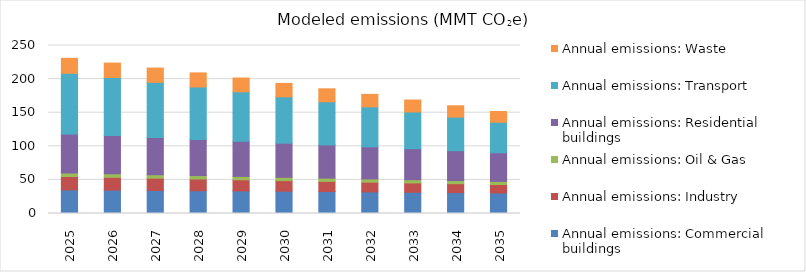
| Category | Annual emissions: Commercial buildings | Annual emissions: Industry | Annual emissions: Oil & Gas | Annual emissions: Residential buildings | Annual emissions: Transport | Annual emissions: Waste |
|---|---|---|---|---|---|---|
| 2025.0 | 35.146 | 19.883 | 5.265 | 58.171 | 90.126 | 22.368 |
| 2026.0 | 34.82 | 19.058 | 5.203 | 57.044 | 86.285 | 21.452 |
| 2027.0 | 34.327 | 18.23 | 5.14 | 55.218 | 82.245 | 21.249 |
| 2028.0 | 33.962 | 17.4 | 5.077 | 53.811 | 78.047 | 20.937 |
| 2029.0 | 33.598 | 16.566 | 5.013 | 52.356 | 73.587 | 20.511 |
| 2030.0 | 33.175 | 15.722 | 4.95 | 50.776 | 68.969 | 19.971 |
| 2031.0 | 32.667 | 15.113 | 4.886 | 49.363 | 64.199 | 19.33 |
| 2032.0 | 32.139 | 14.499 | 4.823 | 47.797 | 59.395 | 18.608 |
| 2033.0 | 31.624 | 13.879 | 4.759 | 46.205 | 54.63 | 17.788 |
| 2034.0 | 31.11 | 13.248 | 4.695 | 44.447 | 49.938 | 16.905 |
| 2035.0 | 30.573 | 12.596 | 4.631 | 42.609 | 45.393 | 15.973 |